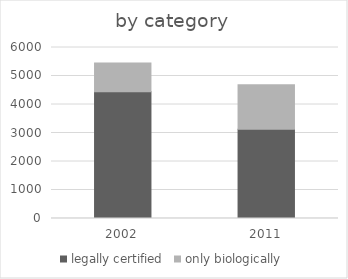
| Category | legally certified | only biologically |
|---|---|---|
| 2002.0 | 4450.1 | 1006.6 |
| 2011.0 | 3131.5 | 1565.6 |